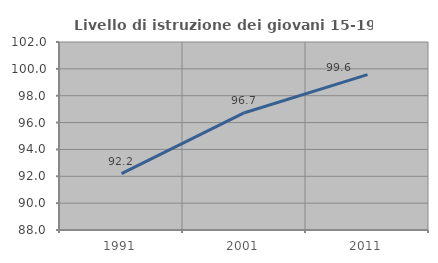
| Category | Livello di istruzione dei giovani 15-19 anni |
|---|---|
| 1991.0 | 92.203 |
| 2001.0 | 96.735 |
| 2011.0 | 99.571 |